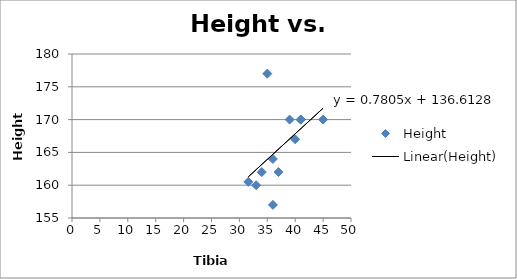
| Category | Height |
|---|---|
| 31.6 | 160.5 |
| 33.0 | 160 |
| 40.0 | 167 |
| 34.0 | 162 |
| 45.0 | 170 |
| 36.0 | 164 |
| 37.0 | 162 |
| 41.0 | 170 |
| 41.0 | 170 |
| 39.0 | 170 |
| 36.0 | 157 |
| 35.0 | 177 |